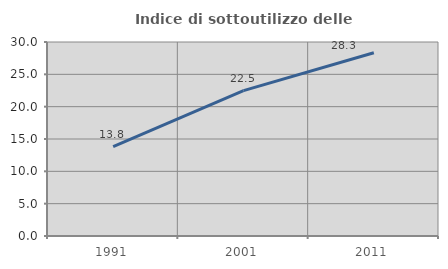
| Category | Indice di sottoutilizzo delle abitazioni  |
|---|---|
| 1991.0 | 13.81 |
| 2001.0 | 22.476 |
| 2011.0 | 28.331 |